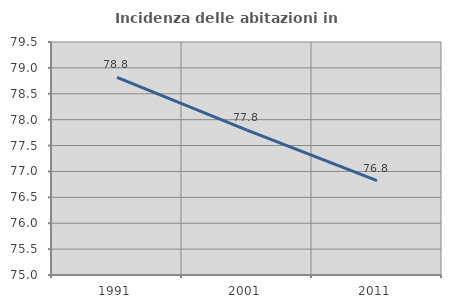
| Category | Incidenza delle abitazioni in proprietà  |
|---|---|
| 1991.0 | 78.819 |
| 2001.0 | 77.798 |
| 2011.0 | 76.821 |